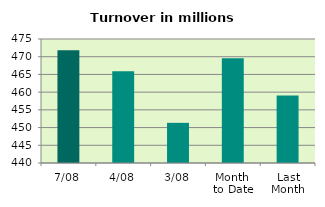
| Category | Series 0 |
|---|---|
| 7/08 | 471.845 |
| 4/08 | 465.9 |
| 3/08 | 451.334 |
| Month 
to Date | 469.534 |
| Last
Month | 459.043 |